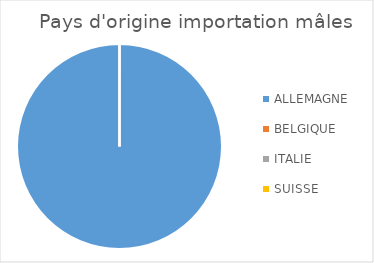
| Category | Series 0 |
|---|---|
| ALLEMAGNE | 2 |
| BELGIQUE | 0 |
| ITALIE | 0 |
| SUISSE | 0 |